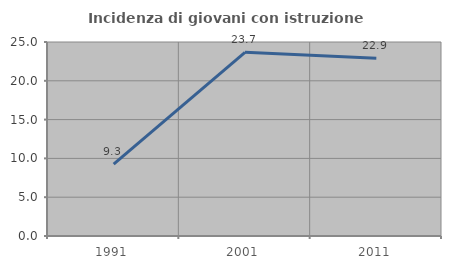
| Category | Incidenza di giovani con istruzione universitaria |
|---|---|
| 1991.0 | 9.268 |
| 2001.0 | 23.671 |
| 2011.0 | 22.917 |